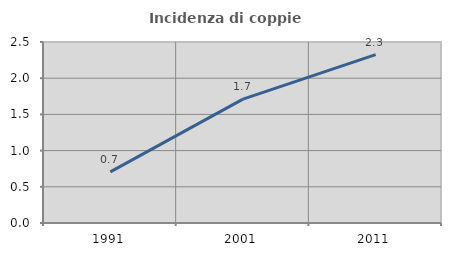
| Category | Incidenza di coppie miste |
|---|---|
| 1991.0 | 0.706 |
| 2001.0 | 1.711 |
| 2011.0 | 2.326 |